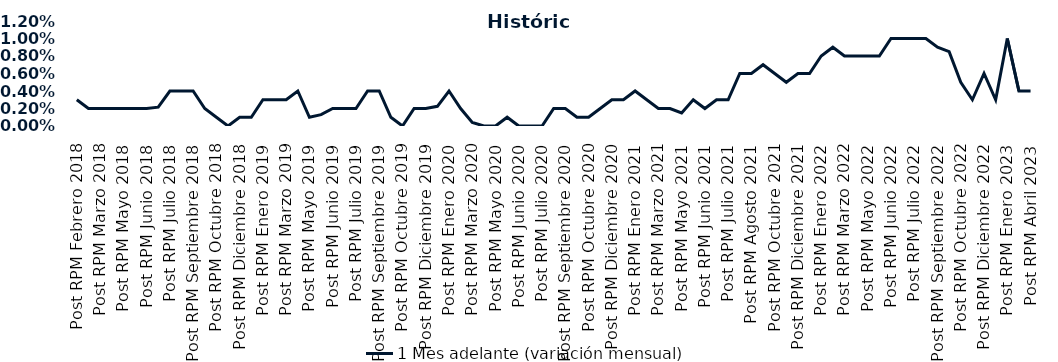
| Category | 1 Mes adelante (variación mensual) |
|---|---|
| Post RPM Febrero 2018 | 0.003 |
| Pre RPM Marzo 2018 | 0.002 |
| Post RPM Marzo 2018 | 0.002 |
| Pre RPM Mayo 2018 | 0.002 |
| Post RPM Mayo 2018 | 0.002 |
| Pre RPM Junio 2018 | 0.002 |
| Post RPM Junio 2018 | 0.002 |
| Pre RPM Julio 2018 | 0.002 |
| Post RPM Julio 2018 | 0.004 |
| Pre RPM Septiembre 2018 | 0.004 |
| Post RPM Septiembre 2018 | 0.004 |
| Pre RPM Octubre 2018 | 0.002 |
| Post RPM Octubre 2018 | 0.001 |
| Pre RPM Diciembre 2018 | 0 |
| Post RPM Diciembre 2018 | 0.001 |
| Pre RPM Enero 2019 | 0.001 |
| Post RPM Enero 2019 | 0.003 |
| Pre RPM Marzo 2019 | 0.003 |
| Post RPM Marzo 2019 | 0.003 |
| Pre RPM Mayo 2019 | 0.004 |
| Post RPM Mayo 2019 | 0.001 |
| Pre RPM Junio 2019 | 0.001 |
| Post RPM Junio 2019 | 0.002 |
| Pre RPM Julio 2019 | 0.002 |
| Post RPM Julio 2019 | 0.002 |
| Pre RPM Septiembre 2019 | 0.004 |
| Post RPM Septiembre 2019 | 0.004 |
| Pre RPM Octubre 2019 | 0.001 |
| Post RPM Octubre 2019 | 0 |
| Pre RPM Diciembre 2019 | 0.002 |
| Post RPM Diciembre 2019 | 0.002 |
| Pre RPM Enero 2020 | 0.002 |
| Post RPM Enero 2020 | 0.004 |
| Pre RPM Marzo 2020 | 0.002 |
| Post RPM Marzo 2020 | 0 |
| Pre RPM Mayo 2020 | 0 |
| Post RPM Mayo 2020 | 0 |
| Pre RPM Junio 2020 | 0.001 |
| Post RPM Junio 2020 | 0 |
| Pre RPM Julio 2020 | 0 |
| Post RPM Julio 2020 | 0 |
| Pre RPM Septiembre 2020 | 0.002 |
| Post RPM Septiembre 2020 | 0.002 |
| Pre RPM Octubre 2020 | 0.001 |
| Post RPM Octubre 2020 | 0.001 |
| Pre RPM Diciembre 2020 | 0.002 |
| Post RPM Diciembre 2020 | 0.003 |
| Pre RPM Enero 2021 | 0.003 |
| Post RPM Enero 2021 | 0.004 |
| Pre RPM Marzo 2021 | 0.003 |
| Post RPM Marzo 2021 | 0.002 |
| Pre RPM Mayo 2021 | 0.002 |
| Post RPM Mayo 2021 | 0.002 |
| Pre RPM Junio 2021 | 0.003 |
| Post RPM Junio 2021 | 0.002 |
| Pre RPM Julio 2021 | 0.003 |
| Post RPM Julio 2021 | 0.003 |
| Pre RPM Agosto 2021 | 0.006 |
| Post RPM Agosto 2021 | 0.006 |
| Pre RPM Octubre 2021 | 0.007 |
| Post RPM Octubre 2021 | 0.006 |
| Pre RPM Diciembre 2021 | 0.005 |
| Post RPM Diciembre 2021 | 0.006 |
| Pre RPM Enero 2022 | 0.006 |
| Post RPM Enero 2022 | 0.008 |
| Pre RPM Marzo 2022 | 0.009 |
| Post RPM Marzo 2022 | 0.008 |
| Pre RPM Mayo 2022 | 0.008 |
| Post RPM Mayo 2022 | 0.008 |
| Pre RPM Junio 2022 | 0.008 |
| Post RPM Junio 2022 | 0.01 |
| Pre RPM Julio 2022 | 0.01 |
| Post RPM Julio 2022 | 0.01 |
| Pre RPM Septiembre 2022 | 0.01 |
| Post RPM Septiembre 2022 | 0.009 |
| Pre RPM Octubre 2022 | 0.008 |
| Post RPM Octubre 2022 | 0.005 |
| Pre RPM Diciembre 2022 | 0.003 |
| Post RPM Diciembre 2022 | 0.006 |
| Pre RPM Enero 2023 | 0.003 |
| Post RPM Enero 2023 | 0.01 |
| Pre RPM Abril 2023 | 0.004 |
| Post RPM Abril 2023 | 0.004 |